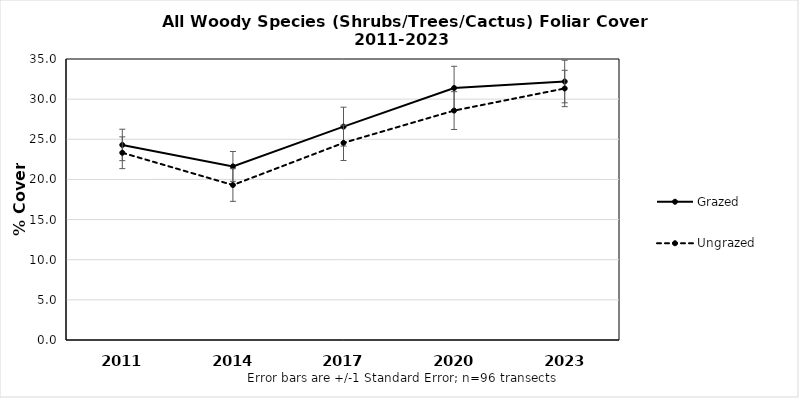
| Category | Grazed | Ungrazed |
|---|---|---|
| 2011.0 | 24.297 | 23.322 |
| 2014.0 | 21.621 | 19.303 |
| 2017.0 | 26.574 | 24.557 |
| 2020.0 | 31.389 | 28.574 |
| 2023.0 | 32.196 | 31.328 |